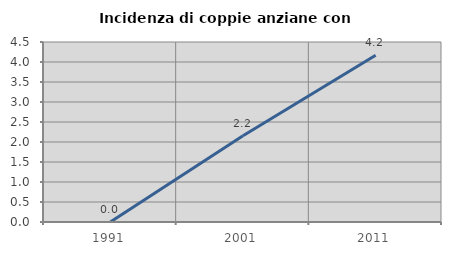
| Category | Incidenza di coppie anziane con figli |
|---|---|
| 1991.0 | 0 |
| 2001.0 | 2.158 |
| 2011.0 | 4.167 |